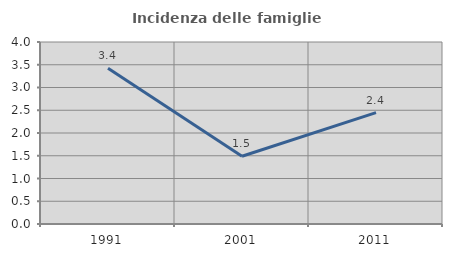
| Category | Incidenza delle famiglie numerose |
|---|---|
| 1991.0 | 3.423 |
| 2001.0 | 1.489 |
| 2011.0 | 2.448 |